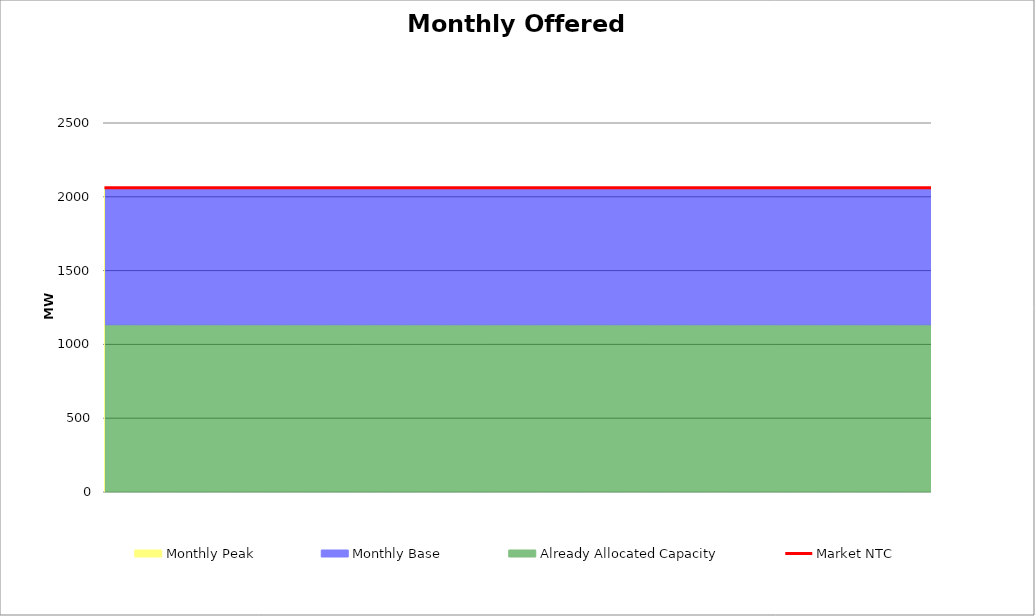
| Category | Market NTC |
|---|---|
| 0 | 2062 |
| 1 | 2062 |
| 2 | 2062 |
| 3 | 2062 |
| 4 | 2062 |
| 5 | 2062 |
| 6 | 2062 |
| 7 | 2061 |
| 8 | 2061 |
| 9 | 2061 |
| 10 | 2061 |
| 11 | 2061 |
| 12 | 2061 |
| 13 | 2061 |
| 14 | 2061 |
| 15 | 2061 |
| 16 | 2061 |
| 17 | 2061 |
| 18 | 2061 |
| 19 | 2061 |
| 20 | 2061 |
| 21 | 2061 |
| 22 | 2061 |
| 23 | 2062 |
| 24 | 2062 |
| 25 | 2062 |
| 26 | 2062 |
| 27 | 2062 |
| 28 | 2062 |
| 29 | 2062 |
| 30 | 2062 |
| 31 | 2061 |
| 32 | 2061 |
| 33 | 2061 |
| 34 | 2061 |
| 35 | 2061 |
| 36 | 2061 |
| 37 | 2061 |
| 38 | 2061 |
| 39 | 2061 |
| 40 | 2061 |
| 41 | 2061 |
| 42 | 2061 |
| 43 | 2061 |
| 44 | 2061 |
| 45 | 2061 |
| 46 | 2061 |
| 47 | 2062 |
| 48 | 2062 |
| 49 | 2062 |
| 50 | 2062 |
| 51 | 2062 |
| 52 | 2062 |
| 53 | 2062 |
| 54 | 2062 |
| 55 | 2062 |
| 56 | 2062 |
| 57 | 2062 |
| 58 | 2062 |
| 59 | 2062 |
| 60 | 2062 |
| 61 | 2062 |
| 62 | 2062 |
| 63 | 2062 |
| 64 | 2062 |
| 65 | 2062 |
| 66 | 2062 |
| 67 | 2062 |
| 68 | 2062 |
| 69 | 2062 |
| 70 | 2062 |
| 71 | 2062 |
| 72 | 2062 |
| 73 | 2062 |
| 74 | 2062 |
| 75 | 2062 |
| 76 | 2062 |
| 77 | 2062 |
| 78 | 2062 |
| 79 | 2061 |
| 80 | 2061 |
| 81 | 2061 |
| 82 | 2061 |
| 83 | 2061 |
| 84 | 2061 |
| 85 | 2061 |
| 86 | 2061 |
| 87 | 2061 |
| 88 | 2061 |
| 89 | 2061 |
| 90 | 2061 |
| 91 | 2061 |
| 92 | 2061 |
| 93 | 2061 |
| 94 | 2061 |
| 95 | 2062 |
| 96 | 2062 |
| 97 | 2062 |
| 98 | 2062 |
| 99 | 2062 |
| 100 | 2062 |
| 101 | 2062 |
| 102 | 2062 |
| 103 | 2061 |
| 104 | 2061 |
| 105 | 2061 |
| 106 | 2061 |
| 107 | 2061 |
| 108 | 2061 |
| 109 | 2061 |
| 110 | 2061 |
| 111 | 2061 |
| 112 | 2061 |
| 113 | 2061 |
| 114 | 2061 |
| 115 | 2061 |
| 116 | 2061 |
| 117 | 2061 |
| 118 | 2061 |
| 119 | 2062 |
| 120 | 2062 |
| 121 | 2062 |
| 122 | 2062 |
| 123 | 2062 |
| 124 | 2062 |
| 125 | 2062 |
| 126 | 2062 |
| 127 | 2061 |
| 128 | 2061 |
| 129 | 2061 |
| 130 | 2061 |
| 131 | 2061 |
| 132 | 2061 |
| 133 | 2061 |
| 134 | 2061 |
| 135 | 2061 |
| 136 | 2061 |
| 137 | 2061 |
| 138 | 2061 |
| 139 | 2061 |
| 140 | 2061 |
| 141 | 2061 |
| 142 | 2061 |
| 143 | 2062 |
| 144 | 2062 |
| 145 | 2062 |
| 146 | 2062 |
| 147 | 2062 |
| 148 | 2062 |
| 149 | 2062 |
| 150 | 2062 |
| 151 | 2061 |
| 152 | 2061 |
| 153 | 2061 |
| 154 | 2061 |
| 155 | 2061 |
| 156 | 2061 |
| 157 | 2061 |
| 158 | 2061 |
| 159 | 2061 |
| 160 | 2061 |
| 161 | 2061 |
| 162 | 2061 |
| 163 | 2061 |
| 164 | 2061 |
| 165 | 2061 |
| 166 | 2061 |
| 167 | 2062 |
| 168 | 2062 |
| 169 | 2062 |
| 170 | 2062 |
| 171 | 2062 |
| 172 | 2062 |
| 173 | 2062 |
| 174 | 2062 |
| 175 | 2061 |
| 176 | 2061 |
| 177 | 2061 |
| 178 | 2061 |
| 179 | 2061 |
| 180 | 2061 |
| 181 | 2061 |
| 182 | 2061 |
| 183 | 2061 |
| 184 | 2061 |
| 185 | 2061 |
| 186 | 2061 |
| 187 | 2061 |
| 188 | 2061 |
| 189 | 2061 |
| 190 | 2061 |
| 191 | 2062 |
| 192 | 2062 |
| 193 | 2062 |
| 194 | 2062 |
| 195 | 2062 |
| 196 | 2062 |
| 197 | 2062 |
| 198 | 2062 |
| 199 | 2061 |
| 200 | 2061 |
| 201 | 2061 |
| 202 | 2061 |
| 203 | 2061 |
| 204 | 2061 |
| 205 | 2061 |
| 206 | 2061 |
| 207 | 2061 |
| 208 | 2061 |
| 209 | 2061 |
| 210 | 2061 |
| 211 | 2061 |
| 212 | 2061 |
| 213 | 2061 |
| 214 | 2061 |
| 215 | 2062 |
| 216 | 2062 |
| 217 | 2062 |
| 218 | 2062 |
| 219 | 2062 |
| 220 | 2062 |
| 221 | 2062 |
| 222 | 2062 |
| 223 | 2062 |
| 224 | 2062 |
| 225 | 2062 |
| 226 | 2062 |
| 227 | 2062 |
| 228 | 2062 |
| 229 | 2062 |
| 230 | 2062 |
| 231 | 2062 |
| 232 | 2062 |
| 233 | 2062 |
| 234 | 2062 |
| 235 | 2062 |
| 236 | 2062 |
| 237 | 2062 |
| 238 | 2062 |
| 239 | 2062 |
| 240 | 2062 |
| 241 | 2062 |
| 242 | 2062 |
| 243 | 2062 |
| 244 | 2062 |
| 245 | 2062 |
| 246 | 2062 |
| 247 | 2061 |
| 248 | 2061 |
| 249 | 2061 |
| 250 | 2061 |
| 251 | 2061 |
| 252 | 2061 |
| 253 | 2061 |
| 254 | 2061 |
| 255 | 2061 |
| 256 | 2061 |
| 257 | 2061 |
| 258 | 2061 |
| 259 | 2061 |
| 260 | 2061 |
| 261 | 2061 |
| 262 | 2061 |
| 263 | 2062 |
| 264 | 2062 |
| 265 | 2062 |
| 266 | 2062 |
| 267 | 2062 |
| 268 | 2062 |
| 269 | 2062 |
| 270 | 2062 |
| 271 | 2061 |
| 272 | 2061 |
| 273 | 2061 |
| 274 | 2061 |
| 275 | 2061 |
| 276 | 2061 |
| 277 | 2061 |
| 278 | 2061 |
| 279 | 2061 |
| 280 | 2061 |
| 281 | 2061 |
| 282 | 2061 |
| 283 | 2061 |
| 284 | 2061 |
| 285 | 2061 |
| 286 | 2061 |
| 287 | 2062 |
| 288 | 2062 |
| 289 | 2062 |
| 290 | 2062 |
| 291 | 2062 |
| 292 | 2062 |
| 293 | 2062 |
| 294 | 2062 |
| 295 | 2061 |
| 296 | 2061 |
| 297 | 2061 |
| 298 | 2061 |
| 299 | 2061 |
| 300 | 2061 |
| 301 | 2061 |
| 302 | 2061 |
| 303 | 2061 |
| 304 | 2061 |
| 305 | 2061 |
| 306 | 2061 |
| 307 | 2061 |
| 308 | 2061 |
| 309 | 2061 |
| 310 | 2061 |
| 311 | 2062 |
| 312 | 2062 |
| 313 | 2062 |
| 314 | 2062 |
| 315 | 2062 |
| 316 | 2062 |
| 317 | 2062 |
| 318 | 2062 |
| 319 | 2061 |
| 320 | 2061 |
| 321 | 2061 |
| 322 | 2061 |
| 323 | 2061 |
| 324 | 2061 |
| 325 | 2061 |
| 326 | 2061 |
| 327 | 2061 |
| 328 | 2061 |
| 329 | 2061 |
| 330 | 2061 |
| 331 | 2061 |
| 332 | 2061 |
| 333 | 2061 |
| 334 | 2061 |
| 335 | 2062 |
| 336 | 2062 |
| 337 | 2062 |
| 338 | 2062 |
| 339 | 2062 |
| 340 | 2062 |
| 341 | 2062 |
| 342 | 2062 |
| 343 | 2061 |
| 344 | 2061 |
| 345 | 2061 |
| 346 | 2061 |
| 347 | 2061 |
| 348 | 2061 |
| 349 | 2061 |
| 350 | 2061 |
| 351 | 2061 |
| 352 | 2061 |
| 353 | 2061 |
| 354 | 2061 |
| 355 | 2061 |
| 356 | 2061 |
| 357 | 2061 |
| 358 | 2061 |
| 359 | 2062 |
| 360 | 2062 |
| 361 | 2062 |
| 362 | 2062 |
| 363 | 2062 |
| 364 | 2062 |
| 365 | 2062 |
| 366 | 2062 |
| 367 | 2061 |
| 368 | 2061 |
| 369 | 2061 |
| 370 | 2061 |
| 371 | 2061 |
| 372 | 2061 |
| 373 | 2061 |
| 374 | 2061 |
| 375 | 2061 |
| 376 | 2061 |
| 377 | 2061 |
| 378 | 2061 |
| 379 | 2061 |
| 380 | 2061 |
| 381 | 2061 |
| 382 | 2061 |
| 383 | 2062 |
| 384 | 2062 |
| 385 | 2062 |
| 386 | 2062 |
| 387 | 2062 |
| 388 | 2062 |
| 389 | 2062 |
| 390 | 2062 |
| 391 | 2062 |
| 392 | 2062 |
| 393 | 2062 |
| 394 | 2062 |
| 395 | 2062 |
| 396 | 2062 |
| 397 | 2062 |
| 398 | 2062 |
| 399 | 2062 |
| 400 | 2062 |
| 401 | 2062 |
| 402 | 2062 |
| 403 | 2062 |
| 404 | 2062 |
| 405 | 2062 |
| 406 | 2062 |
| 407 | 2062 |
| 408 | 2062 |
| 409 | 2062 |
| 410 | 2062 |
| 411 | 2062 |
| 412 | 2062 |
| 413 | 2062 |
| 414 | 2062 |
| 415 | 2061 |
| 416 | 2061 |
| 417 | 2061 |
| 418 | 2061 |
| 419 | 2061 |
| 420 | 2061 |
| 421 | 2061 |
| 422 | 2061 |
| 423 | 2061 |
| 424 | 2061 |
| 425 | 2061 |
| 426 | 2061 |
| 427 | 2061 |
| 428 | 2061 |
| 429 | 2061 |
| 430 | 2061 |
| 431 | 2062 |
| 432 | 2062 |
| 433 | 2062 |
| 434 | 2062 |
| 435 | 2062 |
| 436 | 2062 |
| 437 | 2062 |
| 438 | 2062 |
| 439 | 2061 |
| 440 | 2061 |
| 441 | 2061 |
| 442 | 2061 |
| 443 | 2061 |
| 444 | 2061 |
| 445 | 2061 |
| 446 | 2061 |
| 447 | 2061 |
| 448 | 2061 |
| 449 | 2061 |
| 450 | 2061 |
| 451 | 2061 |
| 452 | 2061 |
| 453 | 2061 |
| 454 | 2061 |
| 455 | 2062 |
| 456 | 2062 |
| 457 | 2062 |
| 458 | 2062 |
| 459 | 2062 |
| 460 | 2062 |
| 461 | 2062 |
| 462 | 2062 |
| 463 | 2061 |
| 464 | 2061 |
| 465 | 2061 |
| 466 | 2061 |
| 467 | 2061 |
| 468 | 2061 |
| 469 | 2061 |
| 470 | 2061 |
| 471 | 2061 |
| 472 | 2061 |
| 473 | 2061 |
| 474 | 2061 |
| 475 | 2061 |
| 476 | 2061 |
| 477 | 2061 |
| 478 | 2061 |
| 479 | 2062 |
| 480 | 2062 |
| 481 | 2062 |
| 482 | 2062 |
| 483 | 2062 |
| 484 | 2062 |
| 485 | 2062 |
| 486 | 2062 |
| 487 | 2061 |
| 488 | 2061 |
| 489 | 2061 |
| 490 | 2061 |
| 491 | 2061 |
| 492 | 2061 |
| 493 | 2061 |
| 494 | 2061 |
| 495 | 2061 |
| 496 | 2061 |
| 497 | 2061 |
| 498 | 2061 |
| 499 | 2061 |
| 500 | 2061 |
| 501 | 2061 |
| 502 | 2061 |
| 503 | 2062 |
| 504 | 2062 |
| 505 | 2062 |
| 506 | 2062 |
| 507 | 2062 |
| 508 | 2062 |
| 509 | 2062 |
| 510 | 2062 |
| 511 | 2061 |
| 512 | 2061 |
| 513 | 2061 |
| 514 | 2061 |
| 515 | 2061 |
| 516 | 2061 |
| 517 | 2061 |
| 518 | 2061 |
| 519 | 2061 |
| 520 | 2061 |
| 521 | 2061 |
| 522 | 2061 |
| 523 | 2061 |
| 524 | 2061 |
| 525 | 2061 |
| 526 | 2061 |
| 527 | 2062 |
| 528 | 2062 |
| 529 | 2062 |
| 530 | 2062 |
| 531 | 2062 |
| 532 | 2062 |
| 533 | 2062 |
| 534 | 2062 |
| 535 | 2061 |
| 536 | 2061 |
| 537 | 2061 |
| 538 | 2061 |
| 539 | 2061 |
| 540 | 2061 |
| 541 | 2061 |
| 542 | 2061 |
| 543 | 2061 |
| 544 | 2061 |
| 545 | 2061 |
| 546 | 2061 |
| 547 | 2061 |
| 548 | 2061 |
| 549 | 2061 |
| 550 | 2061 |
| 551 | 2062 |
| 552 | 2062 |
| 553 | 2062 |
| 554 | 2062 |
| 555 | 2062 |
| 556 | 2062 |
| 557 | 2062 |
| 558 | 2062 |
| 559 | 2062 |
| 560 | 2062 |
| 561 | 2062 |
| 562 | 2062 |
| 563 | 2062 |
| 564 | 2062 |
| 565 | 2062 |
| 566 | 2062 |
| 567 | 2062 |
| 568 | 2062 |
| 569 | 2062 |
| 570 | 2062 |
| 571 | 2062 |
| 572 | 2062 |
| 573 | 2062 |
| 574 | 2062 |
| 575 | 2062 |
| 576 | 2062 |
| 577 | 2062 |
| 578 | 2062 |
| 579 | 2062 |
| 580 | 2062 |
| 581 | 2062 |
| 582 | 2062 |
| 583 | 2061 |
| 584 | 2061 |
| 585 | 2061 |
| 586 | 2061 |
| 587 | 2061 |
| 588 | 2061 |
| 589 | 2061 |
| 590 | 2061 |
| 591 | 2061 |
| 592 | 2061 |
| 593 | 2061 |
| 594 | 2061 |
| 595 | 2061 |
| 596 | 2061 |
| 597 | 2061 |
| 598 | 2061 |
| 599 | 2062 |
| 600 | 2062 |
| 601 | 2062 |
| 602 | 2062 |
| 603 | 2062 |
| 604 | 2062 |
| 605 | 2062 |
| 606 | 2062 |
| 607 | 2061 |
| 608 | 2061 |
| 609 | 2061 |
| 610 | 2061 |
| 611 | 2061 |
| 612 | 2061 |
| 613 | 2061 |
| 614 | 2061 |
| 615 | 2061 |
| 616 | 2061 |
| 617 | 2061 |
| 618 | 2061 |
| 619 | 2061 |
| 620 | 2061 |
| 621 | 2061 |
| 622 | 2061 |
| 623 | 2062 |
| 624 | 2062 |
| 625 | 2062 |
| 626 | 2062 |
| 627 | 2062 |
| 628 | 2062 |
| 629 | 2062 |
| 630 | 2062 |
| 631 | 2061 |
| 632 | 2061 |
| 633 | 2061 |
| 634 | 2061 |
| 635 | 2061 |
| 636 | 2061 |
| 637 | 2061 |
| 638 | 2061 |
| 639 | 2061 |
| 640 | 2061 |
| 641 | 2061 |
| 642 | 2061 |
| 643 | 2061 |
| 644 | 2061 |
| 645 | 2061 |
| 646 | 2061 |
| 647 | 2062 |
| 648 | 2062 |
| 649 | 2062 |
| 650 | 2062 |
| 651 | 2062 |
| 652 | 2062 |
| 653 | 2062 |
| 654 | 2062 |
| 655 | 2061 |
| 656 | 2061 |
| 657 | 2061 |
| 658 | 2061 |
| 659 | 2061 |
| 660 | 2061 |
| 661 | 2061 |
| 662 | 2061 |
| 663 | 2061 |
| 664 | 2061 |
| 665 | 2061 |
| 666 | 2061 |
| 667 | 2061 |
| 668 | 2061 |
| 669 | 2061 |
| 670 | 2061 |
| 671 | 2062 |
| 672 | 2062 |
| 673 | 2062 |
| 674 | 2062 |
| 675 | 2062 |
| 676 | 2062 |
| 677 | 2062 |
| 678 | 2062 |
| 679 | 2061 |
| 680 | 2061 |
| 681 | 2061 |
| 682 | 2061 |
| 683 | 2061 |
| 684 | 2061 |
| 685 | 2061 |
| 686 | 2061 |
| 687 | 2061 |
| 688 | 2061 |
| 689 | 2061 |
| 690 | 2061 |
| 691 | 2061 |
| 692 | 2061 |
| 693 | 2061 |
| 694 | 2061 |
| 695 | 2062 |
| 696 | 2062 |
| 697 | 2062 |
| 698 | 2062 |
| 699 | 2062 |
| 700 | 2062 |
| 701 | 2062 |
| 702 | 2062 |
| 703 | 2061 |
| 704 | 2061 |
| 705 | 2061 |
| 706 | 2061 |
| 707 | 2061 |
| 708 | 2061 |
| 709 | 2061 |
| 710 | 2061 |
| 711 | 2061 |
| 712 | 2061 |
| 713 | 2061 |
| 714 | 2061 |
| 715 | 2061 |
| 716 | 2061 |
| 717 | 2061 |
| 718 | 2061 |
| 719 | 2062 |
| 720 | 2062 |
| 721 | 2062 |
| 722 | 2062 |
| 723 | 2062 |
| 724 | 2062 |
| 725 | 2062 |
| 726 | 2062 |
| 727 | 2062 |
| 728 | 2062 |
| 729 | 2062 |
| 730 | 2062 |
| 731 | 2062 |
| 732 | 2062 |
| 733 | 2062 |
| 734 | 2062 |
| 735 | 2062 |
| 736 | 2062 |
| 737 | 2062 |
| 738 | 2062 |
| 739 | 2062 |
| 740 | 2062 |
| 741 | 2062 |
| 742 | 2062 |
| 743 | 2062 |